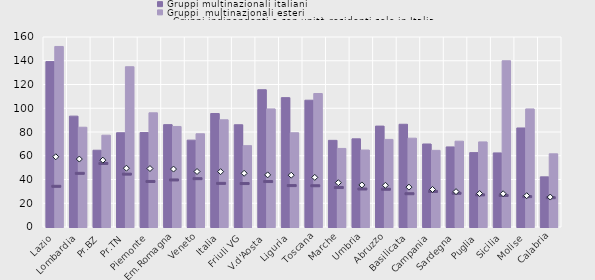
| Category | Gruppi multinazionali italiani | Gruppi  multinazionali esteri |
|---|---|---|
| Lazio | 139.298 | 152.026 |
| Lombardia | 93.363 | 84.021 |
| Pr.BZ | 64.652 | 77.307 |
| Pr.TN | 79.371 | 134.965 |
| Piemonte | 79.542 | 96.15 |
| Em.Romagna | 86.203 | 84.669 |
| Veneto | 73.142 | 78.507 |
| Italia | 95.575 | 90.279 |
| Friuli VG | 86.108 | 68.488 |
| V.d'Aosta | 115.607 | 99.47 |
| Liguria | 108.937 | 79.366 |
| Toscana | 106.775 | 112.415 |
| Marche | 72.969 | 66.159 |
| Umbria | 74.225 | 64.807 |
| Abruzzo | 84.97 | 73.769 |
| Basilicata | 86.508 | 74.795 |
| Campania | 69.898 | 64.542 |
| Sardegna | 67.427 | 72.276 |
| Puglia | 62.634 | 71.659 |
| Sicilia | 62.378 | 139.989 |
| Molise | 83.405 | 99.444 |
| Calabria | 42.238 | 61.626 |